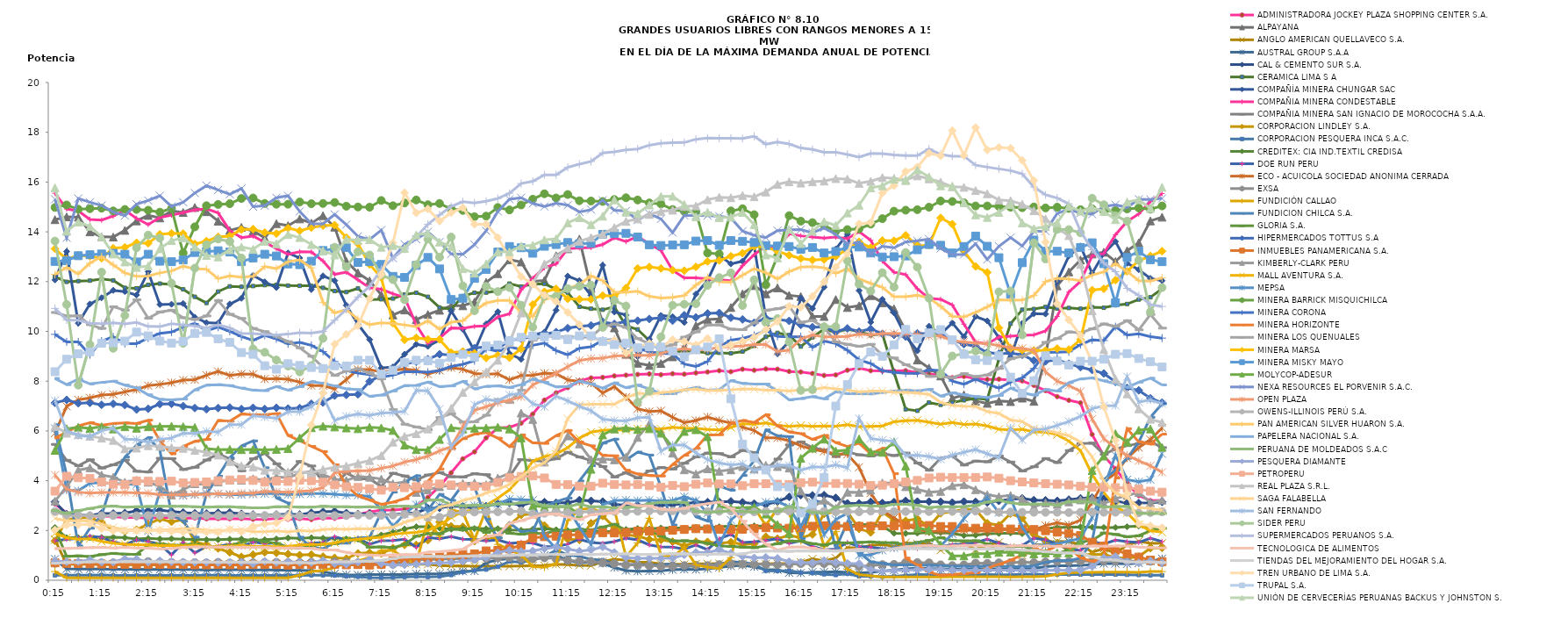
| Category | ADMINISTRADORA JOCKEY PLAZA SHOPPING CENTER S.A. | ALPAYANA | ANGLO AMERICAN QUELLAVECO S.A. | AUSTRAL GROUP S.A.A | CAL & CEMENTO SUR S.A. | CERAMICA LIMA S A | COMPAÑÍA MINERA CHUNGAR SAC | COMPAÑIA MINERA CONDESTABLE | COMPAÑIA MINERA SAN IGNACIO DE MOROCOCHA S.A.A. | CORPORACION LINDLEY S.A. | CORPORACION PESQUERA INCA S.A.C. | CREDITEX: CIA IND.TEXTIL CREDISA | DOE RUN PERU | ECO - ACUICOLA SOCIEDAD ANONIMA CERRADA | EXSA | FUNDICIÓN CALLAO | FUNDICION CHILCA S.A. | GLORIA S.A. | HIPERMERCADOS TOTTUS S.A | INMUEBLES PANAMERICANA S.A. | KIMBERLY-CLARK PERU | MALL AVENTURA S.A. | MEPSA | MINERA BARRICK MISQUICHILCA | MINERA CORONA | MINERA HORIZONTE | MINERA LOS QUENUALES | MINERA MARSA | MINERA MISKY MAYO | MOLYCOP-ADESUR | NEXA RESOURCES EL PORVENIR S.A.C. | OPEN PLAZA | OWENS-ILLINOIS PERÚ S.A. | PAN AMERICAN SILVER HUARON S.A. | PAPELERA NACIONAL S.A. | PERUANA DE MOLDEADOS S.A.C | PESQUERA DIAMANTE | PETROPERU | REAL PLAZA S.R.L. | SAGA FALABELLA | SAN FERNANDO | SIDER PERU | SUPERMERCADOS PERUANOS S.A. | TECNOLOGICA DE ALIMENTOS | TIENDAS DEL MEJORAMIENTO DEL HOGAR S.A. | TREN URBANO DE LIMA S.A. | TRUPAL S.A. | UNIÓN DE CERVECERÍAS PERUANAS BACKUS Y JOHNSTON S. |
|---|---|---|---|---|---|---|---|---|---|---|---|---|---|---|---|---|---|---|---|---|---|---|---|---|---|---|---|---|---|---|---|---|---|---|---|---|---|---|---|---|---|---|---|---|---|---|---|---|
| 2013-03-14 00:15:00 | 3.07 | 14.49 | 1.63 | 0.85 | 3.15 | 12.2 | 12.07 | 15.55 | 5.46 | 1.58 | 0.2 | 2.12 | 1.59 | 5.91 | 0.68 | 0.35 | 6.25 | 2.08 | 7.13 | 0.7 | 3.18 | 1.88 | 6.1 | 14.98 | 9.88 | 5.72 | 10.76 | 13.32 | 12.81 | 5.22 | 15.31 | 4.23 | 2.76 | 12.29 | 8.11 | 2.8 | 0.78 | 3.58 | 6.18 | 2.49 | 7.22 | 13.63 | 10.92 | 1.27 | 0.68 | 2.02 | 8.38 | 15.77 |
| 2013-03-14 00:30:00 | 2.7 | 14.6 | 0.64 | 0.46 | 2.65 | 11.99 | 13.21 | 14.92 | 4.82 | 2.43 | 0.2 | 1.71 | 1.64 | 6.99 | 0.7 | 0.1 | 4.24 | 0.96 | 7.25 | 0.68 | 3.76 | 1.71 | 3.62 | 15.08 | 9.58 | 5.95 | 10.62 | 12.9 | 12.84 | 6.09 | 13.76 | 3.66 | 2.6 | 12.57 | 7.86 | 2.69 | 0.74 | 4.18 | 5.91 | 2.39 | 6.01 | 11.08 | 10.46 | 1.28 | 0.71 | 2.22 | 8.88 | 14.02 |
| 2013-03-14 00:45:00 | 2.62 | 14.59 | 0.64 | 0.45 | 2.62 | 12.02 | 10.33 | 14.84 | 4.6 | 2.5 | 0.2 | 1.71 | 1.68 | 7.25 | 0.68 | 0.1 | 1.38 | 0.98 | 7.11 | 0.67 | 4.42 | 1.65 | 3.6 | 14.91 | 9.58 | 6.2 | 10.63 | 13.05 | 13.04 | 6.15 | 15.34 | 3.54 | 2.6 | 12.31 | 8.08 | 2.8 | 0.75 | 4.12 | 5.85 | 2.4 | 5.82 | 7.84 | 10.45 | 1.3 | 0.71 | 2.23 | 9.1 | 14.39 |
| 2013-03-14 01:00:00 | 2.57 | 14 | 0.64 | 0.45 | 2.6 | 12.04 | 11.1 | 14.5 | 4.84 | 2.52 | 0.2 | 1.71 | 1.77 | 7.33 | 0.71 | 0.1 | 2.09 | 0.95 | 7.13 | 0.66 | 4.52 | 1.67 | 3.9 | 14.93 | 9.06 | 6.33 | 10.27 | 13.02 | 13.08 | 6.1 | 15.19 | 3.5 | 2.59 | 12.74 | 7.89 | 2.88 | 0.82 | 4.09 | 5.79 | 2.37 | 5.77 | 9.47 | 10.33 | 1.31 | 0.74 | 2.25 | 9.18 | 14.22 |
| 2013-03-14 01:15:00 | 2.58 | 13.8 | 0.63 | 0.45 | 2.68 | 12.11 | 11.35 | 14.47 | 4.51 | 2.33 | 0.21 | 1.72 | 1.72 | 7.44 | 0.7 | 0.1 | 2.6 | 1.03 | 7.05 | 0.65 | 4.23 | 1.56 | 3.92 | 14.95 | 9.61 | 6.23 | 10.12 | 12.94 | 13.11 | 6.17 | 15.06 | 3.53 | 2.59 | 13.01 | 7.95 | 2.96 | 0.73 | 3.95 | 5.71 | 2.26 | 6.01 | 12.38 | 10.31 | 1.32 | 0.74 | 2.07 | 9.52 | 13.8 |
| 2013-03-14 01:30:00 | 2.56 | 13.79 | 0.63 | 0.44 | 2.68 | 12.05 | 11.65 | 14.63 | 4.64 | 2.02 | 0.19 | 1.73 | 1.55 | 7.47 | 0.7 | 0.1 | 4.1 | 1.08 | 7.09 | 0.64 | 4.14 | 1.49 | 3.88 | 14.84 | 9.78 | 6.3 | 10.99 | 13.34 | 13.14 | 6.08 | 14.8 | 3.53 | 2.6 | 12.67 | 8 | 2.98 | 0.73 | 3.86 | 5.62 | 2.12 | 6.11 | 9.32 | 10.34 | 1.3 | 0.72 | 1.99 | 9.54 | 13.11 |
| 2013-03-14 01:45:00 | 2.52 | 14.06 | 0.63 | 0.44 | 2.7 | 11.75 | 11.6 | 14.87 | 4.83 | 1.97 | 0.19 | 1.71 | 1.42 | 7.57 | 0.7 | 0.1 | 4.95 | 1.05 | 7.04 | 0.64 | 3.94 | 1.45 | 3.88 | 14.9 | 9.51 | 6.32 | 10.85 | 13.38 | 13.1 | 6.17 | 14.65 | 3.53 | 2.6 | 12.35 | 7.84 | 2.94 | 0.86 | 3.85 | 5.28 | 2.04 | 5.67 | 10.64 | 10.3 | 1.32 | 0.75 | 2 | 9.61 | 12.79 |
| 2013-03-14 02:00:00 | 2.52 | 14.44 | 0.63 | 0.43 | 2.79 | 11.73 | 11.46 | 14.54 | 4.38 | 2.03 | 0.19 | 1.66 | 1.62 | 7.66 | 0.74 | 0.1 | 5.43 | 1.04 | 6.86 | 0.64 | 4.02 | 1.43 | 3.84 | 14.9 | 9.51 | 6.3 | 11.27 | 13.56 | 12.79 | 6.11 | 15.11 | 3.51 | 2.59 | 12.21 | 7.73 | 2.95 | 0.85 | 3.99 | 5.31 | 2.02 | 5.65 | 13.36 | 10.36 | 1.3 | 0.74 | 1.99 | 9.97 | 12.57 |
| 2013-03-14 02:15:00 | 2.5 | 14.66 | 0.62 | 0.44 | 2.79 | 11.87 | 12.4 | 14.29 | 4.35 | 2.25 | 0.19 | 1.68 | 1.56 | 7.82 | 0.75 | 0.1 | 5.73 | 1.42 | 6.89 | 0.63 | 3.94 | 1.42 | 1.98 | 14.87 | 9.73 | 6.43 | 10.53 | 13.54 | 13.1 | 6.17 | 15.26 | 3.5 | 2.6 | 12.22 | 7.45 | 2.96 | 0.73 | 3.98 | 5.41 | 2.03 | 5.55 | 13.87 | 10.2 | 1.29 | 0.75 | 2 | 9.82 | 12.63 |
| 2013-03-14 02:30:00 | 2.52 | 14.56 | 0.62 | 0.43 | 2.81 | 11.92 | 11.08 | 14.58 | 4.9 | 2.47 | 0.19 | 1.66 | 1.45 | 7.87 | 0.73 | 0.1 | 5.23 | 1.47 | 7.08 | 0.64 | 3.77 | 1.39 | 3.56 | 14.79 | 9.92 | 5.6 | 10.78 | 13.9 | 12.82 | 6.18 | 15.45 | 3.44 | 2.6 | 12.35 | 7.27 | 2.97 | 0.78 | 3.97 | 5.38 | 2.02 | 5.66 | 13.75 | 10.19 | 1.26 | 0.74 | 2.01 | 9.61 | 13.32 |
| 2013-03-14 02:45:00 | 2.53 | 14.84 | 0.65 | 0.43 | 2.77 | 11.89 | 11.09 | 14.67 | 4.89 | 2.35 | 0.19 | 1.67 | 1.02 | 7.94 | 0.72 | 0.1 | 2.64 | 1.41 | 7.09 | 0.64 | 3.43 | 1.4 | 3.44 | 14.94 | 9.97 | 5.08 | 10.85 | 13.94 | 12.8 | 6.19 | 15.02 | 3.43 | 2.61 | 12.43 | 7.25 | 2.97 | 0.74 | 3.98 | 5.33 | 2.04 | 5.71 | 11.93 | 10.31 | 1.28 | 0.74 | 1.97 | 9.53 | 13.65 |
| 2013-03-14 03:00:00 | 2.49 | 14.78 | 0.65 | 0.43 | 2.72 | 11.69 | 11.12 | 14.77 | 4.45 | 2.43 | 0.19 | 1.65 | 1.52 | 8.04 | 0.7 | 0.1 | 2.37 | 1.41 | 7 | 0.63 | 3.64 | 1.38 | 3.4 | 13.15 | 10.17 | 5.38 | 10.55 | 13.93 | 12.87 | 6.17 | 15.19 | 3.44 | 2.6 | 12.62 | 7.28 | 2.97 | 0.73 | 3.91 | 5.3 | 2.07 | 5.91 | 9.52 | 10.26 | 1.32 | 0.74 | 1.94 | 9.6 | 13.76 |
| 2013-03-14 03:15:00 | 2.5 | 14.98 | 0.65 | 0.43 | 2.69 | 11.39 | 10.57 | 14.88 | 4.54 | 1.54 | 0.19 | 1.64 | 1.1 | 8.06 | 0.71 | 0.1 | 1.73 | 1.47 | 6.92 | 0.62 | 3.88 | 1.41 | 3.44 | 14.2 | 10.32 | 5.58 | 10.48 | 13.51 | 13.17 | 6.14 | 15.56 | 3.46 | 2.6 | 12.51 | 7.65 | 2.95 | 0.72 | 3.93 | 5.22 | 2.07 | 5.9 | 12.54 | 10.22 | 1.34 | 0.73 | 1.94 | 9.92 | 13.39 |
| 2013-03-14 03:30:00 | 2.47 | 14.81 | 0.64 | 0.41 | 2.68 | 11.14 | 10.35 | 14.93 | 4.83 | 1.43 | 0.2 | 1.63 | 1.36 | 8.24 | 0.7 | 0.1 | 3.46 | 1.36 | 6.87 | 0.62 | 3.85 | 1.36 | 3.5 | 15.05 | 10.02 | 5.66 | 10.62 | 13.63 | 13.21 | 5.29 | 15.86 | 3.45 | 2.6 | 12.5 | 7.84 | 2.94 | 0.72 | 3.95 | 5.14 | 2.01 | 5.99 | 13.48 | 10.13 | 1.34 | 0.73 | 1.94 | 9.96 | 13.05 |
| 2013-03-14 03:45:00 | 2.48 | 14.43 | 0.64 | 0.42 | 2.71 | 11.6 | 10.33 | 14.76 | 5.08 | 1.28 | 0.2 | 1.63 | 1.36 | 8.39 | 0.72 | 0.1 | 4.18 | 1.34 | 6.92 | 0.63 | 3.95 | 1.35 | 3.46 | 15.1 | 10.17 | 6.42 | 11.24 | 13.8 | 13.24 | 5.25 | 15.68 | 3.48 | 2.6 | 12.12 | 7.86 | 2.95 | 0.71 | 4 | 5.03 | 1.98 | 5.95 | 13.71 | 10.26 | 1.33 | 0.72 | 1.93 | 9.7 | 12.99 |
| 2013-03-14 04:00:00 | 2.47 | 14.06 | 0.64 | 0.42 | 2.72 | 11.81 | 11.1 | 14.05 | 4.88 | 1.12 | 0.19 | 1.65 | 1.45 | 8.23 | 0.69 | 0.1 | 4.92 | 1.4 | 6.94 | 0.62 | 4.03 | 1.37 | 3.44 | 15.13 | 10 | 6.39 | 10.69 | 13.83 | 13.19 | 5.26 | 15.51 | 3.46 | 2.59 | 12.23 | 7.82 | 2.95 | 0.72 | 4.03 | 4.77 | 2.04 | 6.25 | 13.61 | 10.14 | 1.33 | 0.73 | 2.04 | 9.56 | 13.28 |
| 2013-03-14 04:15:00 | 2.48 | 14.18 | 0.65 | 0.42 | 2.67 | 11.79 | 11.33 | 13.77 | 4.4 | 0.94 | 0.19 | 1.66 | 1.35 | 8.29 | 0.71 | 0.1 | 5.4 | 1.52 | 6.88 | 0.61 | 4.02 | 1.4 | 3.44 | 15.34 | 9.79 | 6.68 | 10.52 | 14.09 | 12.8 | 5.25 | 15.74 | 3.5 | 2.61 | 12.18 | 7.72 | 2.93 | 0.72 | 4.05 | 4.6 | 2.03 | 6.25 | 12.95 | 9.92 | 1.33 | 0.72 | 1.96 | 9.15 | 13.39 |
| 2013-03-14 04:30:00 | 2.45 | 14.03 | 0.66 | 0.41 | 2.64 | 11.82 | 12.25 | 13.83 | 4.88 | 1.03 | 0.19 | 1.59 | 1.53 | 8.28 | 0.7 | 0.1 | 5.6 | 1.65 | 6.93 | 0.63 | 4.08 | 1.36 | 3.46 | 15.36 | 9.64 | 6.65 | 10.12 | 14.11 | 12.95 | 5.26 | 15.01 | 3.5 | 2.6 | 12.21 | 7.64 | 2.91 | 0.66 | 4.01 | 4.55 | 1.95 | 6.61 | 9.3 | 9.91 | 1.32 | 0.73 | 2.16 | 9.08 | 13.3 |
| 2013-03-14 04:45:00 | 2.44 | 13.76 | 0.66 | 0.42 | 2.6 | 11.86 | 11.99 | 13.58 | 5.1 | 1.12 | 0.19 | 1.63 | 1.47 | 8.09 | 0.71 | 0.1 | 4.52 | 1.55 | 6.88 | 0.63 | 4.01 | 1.36 | 3.48 | 15.14 | 9.84 | 6.65 | 9.99 | 13.97 | 13.1 | 5.24 | 15.05 | 3.57 | 2.6 | 12.61 | 7.62 | 2.91 | 0.76 | 3.94 | 4.42 | 1.95 | 6.56 | 9.16 | 9.88 | 1.31 | 0.73 | 2.26 | 8.62 | 13.62 |
| 2013-03-14 05:00:00 | 2.49 | 14.33 | 0.66 | 0.41 | 2.64 | 11.87 | 11.76 | 13.33 | 4.68 | 1.1 | 0.19 | 1.66 | 1.5 | 8.1 | 0.72 | 0.1 | 3.31 | 1.48 | 6.93 | 0.63 | 4.15 | 1.35 | 3.48 | 15.11 | 9.7 | 6.7 | 9.8 | 13.93 | 13.03 | 5.26 | 15.37 | 3.55 | 2.61 | 12.52 | 7.78 | 2.95 | 0.71 | 3.98 | 4.42 | 1.98 | 6.51 | 8.85 | 9.85 | 1.3 | 0.71 | 2.3 | 8.48 | 13.52 |
| 2013-03-14 05:15:00 | 2.45 | 14.25 | 0.66 | 0.41 | 2.65 | 11.84 | 13.15 | 13.1 | 4.28 | 1.05 | 0.2 | 1.7 | 1.32 | 8.08 | 0.71 | 0.1 | 3.1 | 1.32 | 6.9 | 0.61 | 4.12 | 1.36 | 3.44 | 15.11 | 9.5 | 5.82 | 9.59 | 14.15 | 12.71 | 5.29 | 15.45 | 3.54 | 2.59 | 12.8 | 7.64 | 2.95 | 0.74 | 3.97 | 4.36 | 1.94 | 6.77 | 8.61 | 9.89 | 1.3 | 0.69 | 2.52 | 8.7 | 13.89 |
| 2013-03-14 05:30:00 | 2.48 | 14.52 | 0.65 | 0.4 | 2.64 | 11.83 | 12.95 | 13.2 | 4.77 | 1.01 | 0.19 | 1.68 | 1.41 | 7.96 | 0.71 | 0.2 | 1.73 | 1.29 | 6.92 | 0.63 | 4.3 | 1.42 | 3.46 | 15.2 | 9.56 | 5.61 | 9.34 | 14.04 | 12.68 | 5.72 | 14.82 | 3.57 | 2.59 | 12.87 | 7.78 | 2.94 | 0.72 | 4.02 | 4.35 | 2 | 6.77 | 8.37 | 9.95 | 1.3 | 0.71 | 4.19 | 8.63 | 13.77 |
| 2013-03-14 05:45:00 | 2.44 | 14.35 | 0.64 | 0.39 | 2.71 | 11.83 | 11.68 | 13.19 | 4.59 | 1.03 | 0.2 | 1.71 | 1.49 | 7.82 | 0.72 | 0.35 | 1.32 | 1.39 | 7.09 | 0.63 | 4.37 | 1.44 | 3.48 | 15.13 | 9.44 | 5.38 | 9 | 14.17 | 12.82 | 6.13 | 14.33 | 3.6 | 2.59 | 12.55 | 7.98 | 2.94 | 0.71 | 4 | 4.32 | 1.97 | 6.98 | 8.62 | 9.93 | 1.28 | 0.69 | 6.24 | 8.55 | 13.49 |
| 2013-03-14 06:00:00 | 2.5 | 14.65 | 0.64 | 0.34 | 2.75 | 11.75 | 12.23 | 12.83 | 3.95 | 0.95 | 0.2 | 1.69 | 1.52 | 7.82 | 0.71 | 0.39 | 1.27 | 1.45 | 7.14 | 0.64 | 4.24 | 1.45 | 3.48 | 15.14 | 9.19 | 5.17 | 8.56 | 14.25 | 13.25 | 6.19 | 14.32 | 3.73 | 2.6 | 11.17 | 7.91 | 2.97 | 0.8 | 3.94 | 4.45 | 2.04 | 7.38 | 9.72 | 10 | 1.22 | 0.72 | 7.52 | 8.51 | 13.24 |
| 2013-03-14 06:15:00 | 2.49 | 14.19 | 0.64 | 0.26 | 2.77 | 11.62 | 12.04 | 12.29 | 3.86 | 0.9 | 0.19 | 1.69 | 1.75 | 7.69 | 0.75 | 0.51 | 1.5 | 1.47 | 7.42 | 0.64 | 4.06 | 1.5 | 3.46 | 15.18 | 8.79 | 4.64 | 8.23 | 14.27 | 13.32 | 6.16 | 14.7 | 4.32 | 2.6 | 10.74 | 7.81 | 2.95 | 0.67 | 3.83 | 4.54 | 2.06 | 6.42 | 13.38 | 10.45 | 1.22 | 0.74 | 9.49 | 8.62 | 13.07 |
| 2013-03-14 06:30:00 | 2.54 | 12.82 | 0.63 | 0.22 | 2.7 | 11.58 | 11.05 | 12.38 | 4.31 | 0.87 | 0.16 | 1.66 | 1.62 | 8.06 | 0.73 | 0.7 | 1.49 | 1.69 | 7.45 | 0.62 | 4.01 | 1.6 | 3.42 | 15.03 | 8.43 | 3.8 | 8.41 | 13.77 | 13.37 | 6.12 | 14.29 | 4.38 | 2.6 | 10.88 | 7.69 | 2.95 | 0.64 | 3.76 | 4.59 | 2.05 | 6.59 | 12.59 | 10.88 | 1.12 | 0.74 | 9.88 | 8.61 | 13.7 |
| 2013-03-14 06:45:00 | 2.64 | 12.35 | 0.63 | 0.21 | 2.66 | 11.73 | 10.29 | 12.07 | 4.07 | 1.08 | 0.14 | 1.65 | 1.68 | 8.47 | 0.7 | 0.78 | 1.7 | 1.62 | 7.47 | 0.63 | 4.17 | 1.64 | 3.42 | 15 | 8.32 | 3.39 | 8.5 | 13.52 | 12.77 | 6.09 | 13.82 | 4.39 | 2.62 | 10.49 | 7.66 | 2.94 | 0.73 | 3.73 | 4.7 | 2.07 | 6.68 | 13.2 | 11.38 | 1.03 | 0.76 | 10.23 | 8.84 | 13.66 |
| 2013-03-14 07:00:00 | 2.75 | 12.03 | 0.64 | 0.23 | 2.67 | 11.28 | 9.67 | 11.75 | 4.07 | 1.11 | 0.11 | 1.69 | 1.45 | 8.47 | 0.68 | 0.91 | 1.72 | 1.33 | 7.99 | 0.61 | 4.14 | 1.69 | 3.36 | 14.99 | 8.26 | 3.22 | 8.32 | 12.69 | 12.8 | 6.15 | 13.69 | 4.41 | 2.61 | 10.27 | 7.39 | 2.95 | 0.85 | 3.68 | 4.81 | 2.06 | 6.62 | 13.07 | 11.81 | 1.01 | 0.76 | 11.32 | 8.84 | 13.69 |
| 2013-03-14 07:15:00 | 2.81 | 11.47 | 0.66 | 0.23 | 2.63 | 11.29 | 8.53 | 11.69 | 3.77 | 1.07 | 0.1 | 1.82 | 1.59 | 8.36 | 0.62 | 1.2 | 2.74 | 1.34 | 8.23 | 0.64 | 4.07 | 1.73 | 2.84 | 15.26 | 8.16 | 3.05 | 8.09 | 12.16 | 12.69 | 6.12 | 14.07 | 4.5 | 2.61 | 10.34 | 7.44 | 2.92 | 0.67 | 3.62 | 5.01 | 2.08 | 6.72 | 12.26 | 12.5 | 1 | 0.8 | 12.29 | 8.28 | 13.38 |
| 2013-03-14 07:30:00 | 2.82 | 10.66 | 0.73 | 0.23 | 2.64 | 11.32 | 8.57 | 11.51 | 4.3 | 1.29 | 0.11 | 1.93 | 1.6 | 8.43 | 0.64 | 1.2 | 3.54 | 1.31 | 8.46 | 0.78 | 3.88 | 1.84 | 2.16 | 15.05 | 8.24 | 3.14 | 6.86 | 10.33 | 12.21 | 6.02 | 12.94 | 4.59 | 2.62 | 10.32 | 7.61 | 2.97 | 0.61 | 3.74 | 5.55 | 2.13 | 6.74 | 12.08 | 12.94 | 1.02 | 0.87 | 13.55 | 8.44 | 13.45 |
| 2013-03-14 07:45:00 | 2.86 | 10.86 | 0.69 | 0.23 | 2.68 | 11.48 | 9.08 | 11.37 | 4.19 | 1.42 | 0.13 | 2.06 | 1.65 | 8.49 | 0.75 | 0.89 | 3.94 | 1.44 | 8.69 | 0.86 | 3.95 | 1.9 | 2.66 | 15.16 | 8.38 | 3.28 | 6.27 | 9.66 | 12.17 | 5.43 | 13.5 | 4.75 | 2.65 | 10.26 | 7.82 | 2.98 | 0.62 | 3.72 | 5.78 | 2.33 | 6.79 | 11.27 | 13.31 | 1.03 | 0.93 | 15.57 | 8.75 | 13.33 |
| 2013-03-14 08:00:00 | 2.96 | 10.47 | 0.64 | 0.26 | 2.71 | 11.55 | 9.48 | 10.26 | 4.03 | 1.42 | 0.15 | 2.15 | 1.32 | 8.43 | 0.81 | 0.67 | 4.2 | 1.77 | 8.78 | 0.88 | 3.53 | 1.92 | 3.04 | 15.28 | 8.38 | 3.59 | 6.16 | 9.74 | 12.65 | 5.25 | 13.7 | 4.85 | 2.66 | 10.19 | 7.83 | 2.95 | 0.64 | 3.76 | 5.89 | 2.47 | 7.63 | 12.68 | 13.8 | 1.04 | 0.94 | 14.76 | 8.84 | 13.88 |
| 2013-03-14 08:15:00 | 3.33 | 10.68 | 0.64 | 0.26 | 2.89 | 11.39 | 9.4 | 9.53 | 4.23 | 1.61 | 0.13 | 2.15 | 1.72 | 8.28 | 0.85 | 2.42 | 2.82 | 1.88 | 8.88 | 0.89 | 3.63 | 2 | 2.78 | 15.09 | 8.36 | 3.98 | 6.05 | 9.68 | 12.97 | 5.24 | 14 | 4.99 | 2.52 | 10.42 | 7.96 | 3.22 | 0.68 | 3.83 | 6.08 | 2.57 | 7.61 | 13.71 | 14.3 | 1.13 | 0.96 | 14.92 | 8.82 | 13.94 |
| 2013-03-14 08:30:00 | 3.77 | 10.85 | 0.59 | 0.26 | 2.91 | 10.96 | 9.65 | 9.73 | 4.33 | 2.34 | 0.15 | 2.1 | 1.67 | 8.43 | 0.84 | 1.76 | 3.45 | 1.87 | 9.08 | 0.95 | 3.76 | 2.21 | 3 | 15.14 | 8.43 | 4.47 | 6.54 | 9.68 | 12.51 | 5.66 | 13.59 | 5.2 | 2.53 | 10.09 | 7.78 | 3.23 | 0.69 | 3.87 | 6.4 | 2.94 | 6.88 | 12.98 | 14.68 | 1.15 | 0.95 | 14.43 | 8.72 | 13.59 |
| 2013-03-14 08:45:00 | 4.32 | 11.03 | 0.57 | 0.3 | 2.98 | 10.89 | 10.82 | 10.14 | 4.16 | 2.17 | 0.21 | 2.05 | 1.75 | 8.54 | 0.87 | 2.82 | 3.21 | 2.06 | 9.05 | 1.01 | 3.82 | 2.52 | 3.02 | 14.92 | 8.59 | 5.29 | 6.69 | 9.15 | 11.28 | 6.13 | 13.11 | 5.36 | 2.67 | 10.37 | 7.81 | 3.04 | 0.71 | 3.83 | 6.91 | 3.03 | 5.37 | 13.79 | 15.02 | 1.19 | 0.95 | 14.77 | 8.95 | 13.41 |
| 2013-03-14 09:00:00 | 4.88 | 11.03 | 0.58 | 0.36 | 2.96 | 11.42 | 10.08 | 10.12 | 4.15 | 2.15 | 0.33 | 2.07 | 1.65 | 8.48 | 0.86 | 2.73 | 3.85 | 2.02 | 9.18 | 1.03 | 3.89 | 2.77 | 3 | 14.86 | 8.68 | 5.69 | 6.35 | 9.19 | 11.33 | 6.08 | 13.1 | 6.18 | 2.73 | 10.42 | 7.99 | 2.99 | 0.76 | 3.78 | 7.55 | 3.2 | 5.9 | 11.83 | 15.21 | 1.25 | 0.97 | 14.97 | 9.08 | 12.52 |
| 2013-03-14 09:15:00 | 5.16 | 11.18 | 0.56 | 0.37 | 2.89 | 11.55 | 9.21 | 10.2 | 4.28 | 1.57 | 0.39 | 2.08 | 1.64 | 8.31 | 0.85 | 1.62 | 3.75 | 2.11 | 9.33 | 1.06 | 3.91 | 2.81 | 3 | 14.61 | 8.82 | 5.87 | 6.37 | 9.12 | 12.13 | 6.11 | 13.49 | 6.83 | 2.74 | 10.83 | 7.69 | 3.02 | 0.83 | 3.77 | 7.97 | 3.32 | 7.05 | 10.83 | 15.16 | 1.53 | 0.98 | 14.3 | 8.97 | 12.34 |
| 2013-03-14 09:30:00 | 5.72 | 11.97 | 0.56 | 0.7 | 2.98 | 11.56 | 10.3 | 10.22 | 4.24 | 1.71 | 0.43 | 2.07 | 1.58 | 8.28 | 0.88 | 2.86 | 2.46 | 1.92 | 9.38 | 1.18 | 3.84 | 3.01 | 2.98 | 14.63 | 9.3 | 5.93 | 6.63 | 8.93 | 12.49 | 6.12 | 14.04 | 6.97 | 2.74 | 11.14 | 7.79 | 3 | 0.91 | 3.77 | 8.37 | 3.51 | 7.27 | 11.81 | 15.23 | 1.76 | 1 | 14.31 | 9.41 | 12.71 |
| 2013-03-14 09:45:00 | 6.12 | 12.32 | 0.56 | 0.83 | 3.07 | 11.62 | 10.79 | 10.58 | 3.87 | 1.68 | 0.54 | 2.07 | 1.62 | 8.3 | 0.9 | 1.44 | 1.7 | 2.07 | 9.3 | 1.2 | 4.11 | 3.3 | 3.06 | 14.98 | 9.2 | 5.71 | 7.26 | 9.04 | 13.19 | 6.15 | 14.82 | 7.13 | 2.75 | 11.24 | 7.81 | 3.07 | 1.11 | 3.93 | 8.84 | 3.64 | 7.2 | 11.6 | 15.34 | 1.83 | 0.98 | 13.77 | 9.45 | 13.19 |
| 2013-03-14 10:00:00 | 6.15 | 12.88 | 0.56 | 0.86 | 3.11 | 11.92 | 9.11 | 10.71 | 4.17 | 2.21 | 0.76 | 2.02 | 1.48 | 8.05 | 0.91 | 1.23 | 2.31 | 1.89 | 9.64 | 1.26 | 4.3 | 3.63 | 3.26 | 14.88 | 9.38 | 5.37 | 7.14 | 8.94 | 13.41 | 6.08 | 15.31 | 7.24 | 2.76 | 11.24 | 7.74 | 3.06 | 1.21 | 4.12 | 9.55 | 3.86 | 7.45 | 11.76 | 15.55 | 2.29 | 1 | 12.97 | 9.62 | 13.2 |
| 2013-03-14 10:15:00 | 6.31 | 12.79 | 0.57 | 0.96 | 3.01 | 11.8 | 8.88 | 11.67 | 4.85 | 2.63 | 0.72 | 2.01 | 1.52 | 8.23 | 0.86 | 1.02 | 1.95 | 1.85 | 9.71 | 1.41 | 6.72 | 4.14 | 3.24 | 15.08 | 9.27 | 5.84 | 7.64 | 9.3 | 13.36 | 5.72 | 15.37 | 7.37 | 2.78 | 10.76 | 7.86 | 3.11 | 1.16 | 4.17 | 10.74 | 4.16 | 7.51 | 11.05 | 15.94 | 2.4 | 1.02 | 12.2 | 9.76 | 13.43 |
| 2013-03-14 10:30:00 | 6.68 | 12.01 | 0.58 | 1.03 | 3.14 | 11.9 | 9.85 | 12.13 | 4.81 | 2.66 | 0.81 | 2.05 | 1.5 | 8.24 | 0.86 | 0.55 | 1.99 | 1.89 | 9.79 | 1.7 | 6.46 | 4.78 | 3.22 | 15.31 | 9.44 | 5.52 | 9.65 | 11.08 | 13.14 | 2.99 | 15.14 | 7.85 | 2.67 | 10.6 | 8.08 | 3.14 | 1.18 | 4.19 | 11.94 | 4.51 | 7.09 | 10.17 | 16.03 | 2.53 | 1.01 | 11.9 | 9.81 | 13.46 |
| 2013-03-14 10:45:00 | 7.24 | 12.05 | 0.59 | 1 | 3.14 | 11.91 | 9.97 | 12.56 | 4.79 | 2.2 | 0.94 | 2.07 | 1.35 | 8.32 | 0.9 | 0.52 | 2.96 | 1.88 | 9.89 | 1.75 | 4.75 | 4.97 | 1.78 | 15.53 | 9.53 | 5.5 | 9.84 | 11.59 | 13.42 | 2.95 | 15.02 | 8.07 | 2.69 | 11.27 | 7.95 | 3 | 1.27 | 4.11 | 12.71 | 4.72 | 6.97 | 11.42 | 16.29 | 2.65 | 1.03 | 11.45 | 9.78 | 13.68 |
| 2013-03-14 11:00:00 | 7.53 | 13.04 | 0.64 | 1 | 3.11 | 11.7 | 10.85 | 12.71 | 4.88 | 1.95 | 1.21 | 2.03 | 1.36 | 8.3 | 0.88 | 0.66 | 3.16 | 1.98 | 9.97 | 1.77 | 5.12 | 5.07 | 1.26 | 15.36 | 9.23 | 5.81 | 9.77 | 11.71 | 13.49 | 2.95 | 15.15 | 8.32 | 2.73 | 11.47 | 7.77 | 2.96 | 1.33 | 3.85 | 12.99 | 5.2 | 7.4 | 11.41 | 16.29 | 2.66 | 1.04 | 11.2 | 9.84 | 13.72 |
| 2013-03-14 11:15:00 | 7.74 | 13.32 | 0.63 | 0.81 | 3.11 | 11.56 | 12.22 | 13.32 | 5.14 | 1.65 | 1.02 | 1.99 | 1.45 | 8.05 | 0.8 | 2.4 | 3.3 | 1.99 | 10.13 | 1.82 | 5.8 | 5.33 | 2.9 | 15.5 | 9.06 | 6.02 | 9.8 | 11.31 | 13.57 | 2.96 | 15.07 | 8.58 | 2.72 | 11.72 | 7.79 | 2.96 | 1.25 | 3.84 | 13.35 | 6.49 | 7.21 | 11.72 | 16.59 | 2.53 | 1.04 | 10.76 | 9.67 | 14.36 |
| 2013-03-14 11:30:00 | 8.01 | 13.71 | 0.6 | 0.7 | 3.22 | 10.99 | 12.04 | 13.35 | 4.95 | 1.62 | 0.96 | 1.99 | 1.65 | 7.99 | 0.76 | 2.85 | 3.99 | 2.05 | 10.2 | 1.83 | 5.48 | 5.71 | 2.14 | 15.25 | 9.32 | 5.55 | 9.75 | 11.29 | 13.52 | 2.65 | 14.8 | 8.83 | 2.73 | 11.88 | 8 | 3.06 | 1.17 | 3.78 | 13.62 | 7.05 | 6.99 | 11.81 | 16.72 | 2.44 | 1.04 | 10.28 | 9.82 | 14.57 |
| 2013-03-14 11:45:00 | 8.13 | 11.73 | 0.59 | 0.74 | 3.19 | 10.91 | 11.45 | 13.37 | 4.81 | 2.29 | 0.84 | 1.96 | 1.52 | 7.92 | 0.75 | 2.88 | 4.6 | 2.02 | 10.24 | 1.88 | 4.85 | 5.95 | 1.44 | 15.24 | 9.38 | 5.4 | 9.78 | 11.29 | 13.54 | 4.46 | 14.89 | 8.91 | 2.76 | 12.23 | 7.89 | 2.95 | 1.22 | 3.78 | 13.77 | 7.07 | 6.81 | 11.86 | 16.83 | 2.63 | 1.03 | 9.74 | 9.82 | 14.29 |
| 2013-03-14 12:00:00 | 8.15 | 10.38 | 0.75 | 0.68 | 3.16 | 10.87 | 12.66 | 13.49 | 4.57 | 2.58 | 0.81 | 1.96 | 1.48 | 7.52 | 0.7 | 2.72 | 5.51 | 2.14 | 10.38 | 1.91 | 4.87 | 6.02 | 3.04 | 15.22 | 9.64 | 5.02 | 10.18 | 11.44 | 13.9 | 5.84 | 15.27 | 8.92 | 2.77 | 12.04 | 7.72 | 2.95 | 1.34 | 3.9 | 13.91 | 7.07 | 6.47 | 10.16 | 17.17 | 2.67 | 1.05 | 9.6 | 9.59 | 14.63 |
| 2013-03-14 12:15:00 | 8.21 | 10.14 | 0.85 | 0.51 | 3.05 | 10.99 | 10.78 | 13.76 | 4.15 | 2.13 | 0.67 | 1.97 | 1.55 | 7.78 | 0.67 | 2.85 | 5.67 | 2.25 | 10.3 | 1.9 | 4.84 | 6.05 | 3.2 | 15.3 | 9.67 | 5 | 10.3 | 11.42 | 13.93 | 6.08 | 14.87 | 9.01 | 2.77 | 11.58 | 7.93 | 2.91 | 1.12 | 3.85 | 14.17 | 7.07 | 6.42 | 11.25 | 17.21 | 2.71 | 1.05 | 9.65 | 9.47 | 15.29 |
| 2013-03-14 12:30:00 | 8.24 | 9.08 | 0.8 | 0.39 | 3.02 | 10.22 | 10.66 | 13.61 | 4.32 | 1.83 | 0.63 | 2.04 | 1.69 | 7.36 | 0.62 | 0.94 | 4.83 | 2.02 | 10.4 | 1.92 | 4.95 | 6.03 | 3.22 | 15.37 | 9.2 | 4.42 | 10.16 | 11.74 | 13.94 | 6.12 | 14.84 | 9.03 | 2.76 | 11.57 | 7.74 | 2.93 | 0.91 | 3.83 | 14.42 | 7.32 | 6.4 | 11.02 | 17.29 | 3.1 | 1.07 | 9.14 | 9.53 | 14.79 |
| 2013-03-14 12:45:00 | 8.27 | 8.72 | 0.73 | 0.36 | 2.99 | 10.08 | 8.99 | 13.81 | 4.11 | 1.77 | 0.64 | 2.08 | 1.62 | 6.89 | 0.61 | 1.5 | 5.15 | 1.91 | 10.43 | 1.97 | 5.74 | 6.08 | 3.2 | 15.28 | 9.33 | 4.27 | 9.71 | 12.53 | 13.79 | 6.06 | 14.47 | 9.05 | 2.77 | 11.61 | 7.84 | 2.95 | 0.88 | 3.85 | 14.52 | 7.52 | 6.53 | 7.15 | 17.33 | 3 | 1.04 | 9.37 | 9.34 | 14.74 |
| 2013-03-14 13:00:00 | 8.29 | 8.63 | 0.72 | 0.37 | 3.04 | 9.63 | 9.69 | 13.52 | 4.39 | 1.64 | 0.61 | 2.06 | 1.42 | 6.78 | 0.6 | 2.49 | 5.03 | 2.02 | 10.5 | 1.97 | 6.29 | 6.08 | 3.22 | 15.16 | 9.18 | 4.21 | 9.5 | 12.59 | 13.48 | 6.09 | 14.73 | 9.03 | 2.79 | 11.41 | 7.69 | 3.07 | 0.88 | 3.8 | 14.7 | 7.47 | 6.55 | 7.6 | 17.48 | 2.98 | 1.04 | 9.52 | 9.38 | 15.08 |
| 2013-03-14 13:15:00 | 8.26 | 8.71 | 0.65 | 0.38 | 3.02 | 9.2 | 10.64 | 13.25 | 4.53 | 1.62 | 0.63 | 2.1 | 1.34 | 6.81 | 0.56 | 1.02 | 3.75 | 1.78 | 10.55 | 1.98 | 5.98 | 6.08 | 3.18 | 15.12 | 9.12 | 4.19 | 9.35 | 12.53 | 13.45 | 5.91 | 14.52 | 9.11 | 2.78 | 11.34 | 7.5 | 3.13 | 0.88 | 3.74 | 14.82 | 7.54 | 5.19 | 9.78 | 17.56 | 2.86 | 1.05 | 9.37 | 9.37 | 15.42 |
| 2013-03-14 13:30:00 | 8.3 | 8.98 | 0.64 | 0.42 | 3.03 | 9.2 | 10.59 | 12.45 | 4.47 | 1.55 | 0.66 | 2.11 | 1.33 | 6.55 | 0.56 | 0.94 | 2.22 | 1.58 | 10.43 | 2.01 | 5.11 | 6.15 | 3.2 | 14.9 | 9.1 | 4.65 | 9.46 | 12.46 | 13.47 | 5.36 | 13.97 | 9.24 | 2.79 | 11.37 | 7.5 | 3.14 | 0.89 | 3.81 | 14.87 | 7.58 | 5.44 | 11.05 | 17.58 | 2.83 | 1.07 | 9.67 | 9.2 | 15.43 |
| 2013-03-14 13:45:00 | 8.28 | 9.38 | 0.64 | 0.44 | 3.08 | 9.2 | 10.36 | 12.15 | 4.7 | 1.38 | 0.53 | 2.09 | 1.25 | 6.33 | 0.59 | 1.32 | 3.32 | 1.59 | 10.65 | 2.04 | 4.44 | 6.11 | 3.36 | 14.82 | 8.69 | 5.02 | 9.77 | 12.44 | 13.48 | 5.98 | 14.66 | 9.3 | 2.8 | 11.44 | 7.65 | 3.13 | 1.02 | 3.76 | 15.02 | 7.65 | 5.43 | 11.09 | 17.59 | 2.89 | 1.06 | 9.59 | 8.98 | 15.1 |
| 2013-03-14 14:00:00 | 8.33 | 10.23 | 0.66 | 0.43 | 3.13 | 9.2 | 11.5 | 12.15 | 4.96 | 1.55 | 0.6 | 2.12 | 1.42 | 6.42 | 0.6 | 0.62 | 2.55 | 1.56 | 10.56 | 2.07 | 4.27 | 6.1 | 3.2 | 14.8 | 8.59 | 5.3 | 9.98 | 12.59 | 13.63 | 6.05 | 14.66 | 9.24 | 2.77 | 11.86 | 7.75 | 2.77 | 1.12 | 3.86 | 15.04 | 7.68 | 5.12 | 11.11 | 17.72 | 3.01 | 1.04 | 9.45 | 9.26 | 14.6 |
| 2013-03-14 14:15:00 | 8.37 | 10.48 | 0.66 | 0.46 | 3.14 | 9.13 | 12.05 | 12.11 | 5.11 | 1.54 | 0.61 | 2.11 | 1.23 | 6.56 | 0.59 | 0.53 | 2.38 | 1.48 | 10.72 | 2.06 | 4.48 | 6.06 | 2.7 | 13.15 | 8.79 | 5.84 | 10.26 | 12.81 | 13.65 | 5.77 | 14.65 | 9.28 | 2.76 | 12.18 | 7.64 | 2.73 | 1.11 | 3.91 | 15.29 | 7.62 | 4.85 | 11.85 | 17.77 | 3.08 | 1.04 | 9.72 | 9.37 | 14.79 |
| 2013-03-14 14:30:00 | 8.42 | 10.5 | 0.67 | 0.51 | 3.15 | 9.14 | 13.06 | 12.07 | 5.09 | 1.48 | 0.65 | 2.15 | 1.66 | 6.42 | 0.63 | 0.47 | 3.79 | 1.38 | 10.74 | 2.05 | 4.38 | 6.04 | 1.4 | 13.11 | 9.39 | 5.85 | 10.26 | 12.85 | 13.46 | 2.95 | 14.63 | 9.36 | 2.77 | 11.99 | 7.66 | 2.75 | 1.22 | 3.87 | 15.39 | 7.63 | 4.72 | 12.16 | 17.76 | 3.14 | 1.06 | 9.33 | 9.7 | 14.57 |
| 2013-03-14 14:45:00 | 8.38 | 10.96 | 0.66 | 0.57 | 3.17 | 9.12 | 12.71 | 12.04 | 4.96 | 1.53 | 0.74 | 2.18 | 1.85 | 6.32 | 0.65 | 0.91 | 3.62 | 1.36 | 10.55 | 2.04 | 4.44 | 6.14 | 2.42 | 14.84 | 9.65 | 6.3 | 10.09 | 13.02 | 13.65 | 2.91 | 14.56 | 9.39 | 2.78 | 11.98 | 8.02 | 2.8 | 1.09 | 3.87 | 15.37 | 7.65 | 4.63 | 12.35 | 17.76 | 2.88 | 1.05 | 9.46 | 7.29 | 14.59 |
| 2013-03-14 15:00:00 | 8.48 | 11.51 | 0.66 | 0.6 | 3.13 | 9.19 | 12.82 | 12.64 | 5.22 | 1.44 | 0.72 | 2.18 | 1.52 | 6.15 | 0.65 | 2.79 | 4.21 | 1.33 | 10.48 | 2.05 | 4.57 | 6.29 | 2.82 | 14.93 | 9.72 | 6.42 | 10.07 | 13.14 | 13.62 | 2.91 | 14.03 | 9.42 | 2.75 | 12.26 | 7.91 | 2.76 | 0.96 | 3.8 | 15.46 | 7.69 | 4.68 | 11.04 | 17.75 | 2.37 | 1.06 | 9.6 | 5.47 | 14.78 |
| 2013-03-14 15:15:00 | 8.44 | 11.84 | 0.65 | 0.54 | 3.08 | 9.42 | 13.42 | 13.08 | 5.13 | 1.46 | 0.65 | 2.19 | 1.54 | 6.02 | 0.64 | 2.92 | 4.81 | 1.31 | 10.35 | 2.08 | 4.47 | 6.27 | 2.96 | 14.69 | 9.84 | 6.34 | 10.34 | 13.42 | 13.57 | 2.94 | 13.86 | 9.47 | 2.75 | 12.52 | 7.88 | 2.74 | 0.9 | 3.88 | 15.41 | 7.68 | 4.41 | 12.07 | 17.84 | 1.85 | 1.15 | 9.76 | 4.92 | 14.29 |
| 2013-03-14 15:30:00 | 8.49 | 11.51 | 0.66 | 0.43 | 3.04 | 9.78 | 10.55 | 13.44 | 4.42 | 1.75 | 0.38 | 2.16 | 1.6 | 5.72 | 0.64 | 2.2 | 6.04 | 1.38 | 10.52 | 2.11 | 4.62 | 6.32 | 3.14 | 11.87 | 10.04 | 6.65 | 10.85 | 13.39 | 13.45 | 2.66 | 13.77 | 9.47 | 2.77 | 12.36 | 7.88 | 2.75 | 0.92 | 3.88 | 15.6 | 7.64 | 4.51 | 10.36 | 17.52 | 1.45 | 1.17 | 10.07 | 4.43 | 13.07 |
| 2013-03-14 15:45:00 | 8.48 | 11.75 | 0.67 | 0.42 | 3.16 | 9.94 | 9.1 | 13.34 | 4.87 | 1.67 | 0.37 | 2.14 | 1.67 | 5.72 | 0.63 | 2.89 | 5.8 | 1.47 | 10.48 | 2.1 | 4.57 | 6.23 | 3.18 | 13.02 | 9.8 | 6.2 | 10.91 | 13.22 | 13.43 | 2.24 | 14.05 | 9.19 | 2.78 | 12.11 | 7.61 | 2.77 | 0.88 | 3.86 | 15.91 | 7.64 | 4.63 | 10.51 | 17.61 | 1.21 | 1.17 | 10.4 | 3.76 | 12.95 |
| 2013-03-14 16:00:00 | 8.39 | 11.45 | 0.67 | 0.3 | 3.35 | 9.85 | 9.59 | 13.92 | 5.43 | 1.81 | 0.39 | 2.14 | 1.48 | 5.6 | 0.64 | 2.7 | 5.77 | 1.58 | 10.42 | 2.09 | 4.51 | 6.18 | 2.94 | 14.65 | 9.78 | 5.96 | 11.02 | 13.06 | 13.41 | 1.88 | 14.08 | 9.25 | 2.78 | 12.4 | 7.25 | 2.96 | 0.75 | 3.85 | 16.01 | 7.6 | 4.62 | 9.57 | 17.53 | 1.33 | 1.16 | 11.01 | 3.75 | 14.1 |
| 2013-03-14 16:15:00 | 8.37 | 11.4 | 0.72 | 0.29 | 3.42 | 9.39 | 11.34 | 13.84 | 5.56 | 1.7 | 0.31 | 2.16 | 1.59 | 5.4 | 0.67 | 1.59 | 1.68 | 1.57 | 10.26 | 2.11 | 3.59 | 6.22 | 2.14 | 14.43 | 9.79 | 5.89 | 10.36 | 12.93 | 13.3 | 4.9 | 14.09 | 9.69 | 2.79 | 12.58 | 7.3 | 2.87 | 0.72 | 3.92 | 15.96 | 7.65 | 4.42 | 7.63 | 17.37 | 1.34 | 1.18 | 10.97 | 2.7 | 13.53 |
| 2013-03-14 16:30:00 | 8.31 | 10.6 | 0.86 | 0.33 | 3.41 | 9.76 | 10.92 | 13.79 | 5.33 | 1.84 | 0.29 | 2.17 | 1.36 | 5.26 | 0.67 | 2.98 | 3.21 | 1.47 | 10.17 | 2.17 | 2.94 | 6.18 | 3.14 | 14.37 | 9.36 | 5.66 | 10.44 | 12.87 | 13.37 | 5.31 | 13.96 | 9.86 | 2.78 | 12.6 | 7.38 | 2.73 | 0.7 | 3.94 | 16.01 | 7.66 | 4.56 | 7.66 | 17.31 | 1.29 | 1.17 | 11.41 | 3.06 | 14.03 |
| 2013-03-14 16:45:00 | 8.23 | 10.6 | 0.78 | 0.33 | 3.42 | 10.09 | 11.78 | 13.75 | 5.23 | 2.67 | 0.24 | 2.21 | 1.23 | 5.18 | 0.67 | 1.35 | 3.12 | 1.41 | 10.18 | 2.19 | 3.22 | 6.2 | 1.84 | 14.26 | 9.61 | 5.82 | 10.16 | 12.89 | 13.15 | 5.67 | 14.16 | 9.78 | 2.77 | 12.56 | 7.29 | 2.69 | 0.79 | 3.9 | 16.04 | 7.74 | 4.54 | 10.19 | 17.2 | 1.22 | 1.18 | 11.99 | 4.13 | 14.41 |
| 2013-03-14 17:00:00 | 8.25 | 11.28 | 0.89 | 0.34 | 3.31 | 9.97 | 13.31 | 13.79 | 4.97 | 2.76 | 0.21 | 2.19 | 1.25 | 5.08 | 0.65 | 1.95 | 1.28 | 1.52 | 9.99 | 2.2 | 2.89 | 6.19 | 2.44 | 14.02 | 9.51 | 5.53 | 9.58 | 13.01 | 13.21 | 5.19 | 13.9 | 9.78 | 2.75 | 12.33 | 7.57 | 2.93 | 0.72 | 3.89 | 16.14 | 7.69 | 4.64 | 10.19 | 17.2 | 1.18 | 1.17 | 12.58 | 7 | 14.26 |
| 2013-03-14 17:15:00 | 8.44 | 10.96 | 1.31 | 0.32 | 3.09 | 10.09 | 13.91 | 13.72 | 5.16 | 2.75 | 0.26 | 2.19 | 1.52 | 5.06 | 0.62 | 0.44 | 2.33 | 1.5 | 10.12 | 2.16 | 3.54 | 6.25 | 2.7 | 14.09 | 9.24 | 5.37 | 9.48 | 13.32 | 13.39 | 5.23 | 13.52 | 9.8 | 2.76 | 12.52 | 7.5 | 2.99 | 0.68 | 3.89 | 16.12 | 7.65 | 4.52 | 12.84 | 17.11 | 1.22 | 1.18 | 13.13 | 7.86 | 14.76 |
| 2013-03-14 17:30:00 | 8.53 | 11.03 | 1.3 | 0.29 | 3.09 | 9.99 | 11.64 | 14.01 | 5.04 | 2.07 | 0.16 | 2.24 | 1.36 | 4.54 | 0.56 | 0.23 | 1.12 | 1.52 | 9.99 | 2.17 | 3.53 | 6.17 | 1 | 14.12 | 8.86 | 5.51 | 9.4 | 13.6 | 13.39 | 5.68 | 13.59 | 9.89 | 2.75 | 12.1 | 7.5 | 3.02 | 0.67 | 3.86 | 15.95 | 7.57 | 6.5 | 11.9 | 17 | 1.25 | 1.19 | 14.32 | 8.7 | 15.07 |
| 2013-03-14 17:45:00 | 8.42 | 11.44 | 1.4 | 0.32 | 3.15 | 9.84 | 10.37 | 13.66 | 4.99 | 1.92 | 0.16 | 2.23 | 1.33 | 3.5 | 0.59 | 0.18 | 0.74 | 1.54 | 10.1 | 2.17 | 3.62 | 6.18 | 1.02 | 14.31 | 8.71 | 5.08 | 9.48 | 13.36 | 13.15 | 5.16 | 13.12 | 9.86 | 2.78 | 11.93 | 7.49 | 2.99 | 0.42 | 3.81 | 16.03 | 7.6 | 5.7 | 11.62 | 17.15 | 1.16 | 1.19 | 14.37 | 9.17 | 15.77 |
| 2013-03-14 18:00:00 | 8.41 | 11.15 | 1.44 | 0.37 | 3.1 | 9.9 | 11.29 | 12.83 | 5.09 | 2.74 | 0.14 | 2.17 | 1.26 | 2.82 | 0.63 | 0.13 | 0.68 | 1.51 | 9.9 | 2.19 | 3.91 | 6.2 | 1.2 | 14.53 | 8.42 | 5.3 | 9.05 | 13.65 | 12.99 | 5.14 | 13.42 | 9.91 | 2.77 | 11.77 | 7.55 | 2.98 | 0.36 | 3.82 | 16.18 | 7.6 | 5.63 | 12.36 | 17.14 | 1.21 | 1.21 | 15.56 | 9 | 15.85 |
| 2013-03-14 18:15:00 | 8.41 | 10.91 | 1.36 | 0.41 | 3.14 | 8.35 | 10.74 | 12.38 | 5.01 | 2.41 | 0.16 | 1.89 | 1.26 | 2.5 | 0.64 | 0.13 | 0.62 | 1.51 | 9.86 | 2.18 | 3.91 | 6.37 | 1.3 | 14.83 | 8.35 | 4.28 | 8.93 | 13.64 | 13 | 5.56 | 13.36 | 9.92 | 2.76 | 11.39 | 7.6 | 3.05 | 0.39 | 3.88 | 16.15 | 7.55 | 5.58 | 11.78 | 17.09 | 1.27 | 1.25 | 15.86 | 9.46 | 16.11 |
| 2013-03-14 18:30:00 | 8.42 | 10.04 | 1.51 | 0.46 | 3.19 | 6.87 | 9.81 | 12.28 | 5.11 | 2.39 | 0.19 | 1.88 | 1.3 | 2.2 | 0.72 | 0.13 | 0.62 | 1.42 | 9.79 | 2.21 | 3.76 | 6.41 | 1.36 | 14.87 | 8.32 | 0.89 | 8.66 | 13.86 | 13.03 | 4.59 | 13.59 | 9.91 | 2.76 | 11.39 | 7.64 | 3.05 | 0.41 | 3.95 | 16.09 | 7.55 | 5.02 | 13.17 | 17.06 | 1.35 | 1.27 | 16.42 | 10.08 | 16.06 |
| 2013-03-14 18:45:00 | 8.35 | 8.85 | 1.46 | 0.49 | 3.16 | 6.81 | 9.22 | 11.71 | 4.71 | 2.47 | 0.23 | 1.89 | 1.28 | 2.05 | 0.71 | 0.13 | 0.62 | 1.52 | 9.92 | 2.22 | 3.65 | 6.43 | 1.38 | 14.89 | 8.31 | 0.61 | 8.46 | 13.45 | 13.28 | 2.09 | 13.64 | 9.87 | 2.76 | 11.45 | 7.61 | 3.01 | 0.43 | 4.01 | 16.25 | 7.52 | 5.03 | 12.58 | 17.06 | 1.38 | 1.28 | 16.6 | 9.7 | 16.49 |
| 2013-03-14 19:00:00 | 8.29 | 8.53 | 1.5 | 0.47 | 3.16 | 7.14 | 10.21 | 11.33 | 4.42 | 2.15 | 0.22 | 1.92 | 1.38 | 1.95 | 0.7 | 0.13 | 0.6 | 1.6 | 9.9 | 2.2 | 3.54 | 6.35 | 1.38 | 14.99 | 8.46 | 0.32 | 8.19 | 13.46 | 13.49 | 2.02 | 13.71 | 9.81 | 2.76 | 11.34 | 7.67 | 2.92 | 0.43 | 4.11 | 16.13 | 7.47 | 4.97 | 11.33 | 17.33 | 1.39 | 1.27 | 17.16 | 9.94 | 16.21 |
| 2013-03-14 19:15:00 | 8.24 | 8.21 | 1.21 | 0.46 | 3.15 | 7.05 | 9.89 | 11.29 | 4.9 | 2.69 | 0.22 | 1.91 | 1.35 | 1.98 | 0.62 | 0.13 | 0.59 | 1.71 | 9.88 | 2.16 | 3.57 | 6.27 | 1.38 | 15.24 | 8.42 | 0.2 | 8.19 | 14.56 | 13.46 | 1.42 | 13.33 | 9.82 | 2.77 | 11.01 | 7.4 | 2.95 | 0.43 | 4.14 | 16 | 7.15 | 4.86 | 8.29 | 17.11 | 1.36 | 1.27 | 17.05 | 10.07 | 15.85 |
| 2013-03-14 19:30:00 | 8.14 | 7.31 | 1.36 | 0.45 | 3.12 | 7.14 | 10.34 | 11.06 | 5 | 2.76 | 0.22 | 1.89 | 1.43 | 1.94 | 0.59 | 0.14 | 0.56 | 1.6 | 9.66 | 2.16 | 3.8 | 6.34 | 1.86 | 15.22 | 8 | 0.23 | 8.14 | 14.31 | 13.15 | 0.98 | 13.09 | 9.62 | 2.77 | 10.6 | 7.53 | 2.95 | 0.41 | 4.13 | 15.81 | 7.03 | 5.03 | 9.01 | 17.04 | 1.38 | 1.27 | 18.07 | 9.66 | 15.84 |
| 2013-03-14 19:45:00 | 8.19 | 7.45 | 1.48 | 0.43 | 3.16 | 7.23 | 9.78 | 10.29 | 4.63 | 2.84 | 0.22 | 1.8 | 1.45 | 2.02 | 0.62 | 0.14 | 0.56 | 1.58 | 9.49 | 2.1 | 3.84 | 6.26 | 2.48 | 15.17 | 7.88 | 0.27 | 8.3 | 13.22 | 13.41 | 0.98 | 13.09 | 9.58 | 2.76 | 10.58 | 7.45 | 2.96 | 0.4 | 4.13 | 15.79 | 6.99 | 5.14 | 9.11 | 17.04 | 1.4 | 1.27 | 17.07 | 9.08 | 15.17 |
| 2013-03-14 20:00:00 | 8.1 | 7.2 | 1.24 | 0.45 | 3.15 | 7.31 | 10.6 | 9.57 | 4.79 | 2.85 | 0.22 | 1.81 | 1.52 | 2 | 0.69 | 0.14 | 0.55 | 1.59 | 9.4 | 2.09 | 3.64 | 6.28 | 2.98 | 15.04 | 8.08 | 0.3 | 8.18 | 12.61 | 13.83 | 1.07 | 13.52 | 9.53 | 2.78 | 10.76 | 7.38 | 3.01 | 0.41 | 4.13 | 15.66 | 6.98 | 5.25 | 9.21 | 16.68 | 1.4 | 1.26 | 18.19 | 8.86 | 14.68 |
| 2013-03-14 20:15:00 | 8.07 | 7.11 | 1.42 | 0.47 | 3.13 | 7.27 | 10.42 | 9.5 | 4.76 | 2.29 | 0.23 | 1.87 | 1.65 | 1.97 | 0.68 | 0.14 | 0.57 | 1.46 | 9.15 | 2.11 | 3.44 | 6.2 | 3.32 | 15.04 | 7.89 | 0.5 | 8.25 | 12.37 | 13.42 | 1.07 | 12.89 | 9.51 | 2.77 | 10.98 | 7.35 | 3.14 | 0.41 | 4.15 | 15.53 | 6.78 | 5.08 | 9.06 | 16.6 | 1.38 | 1.26 | 17.29 | 8.83 | 14.58 |
| 2013-03-14 20:30:00 | 8.08 | 7.2 | 1.52 | 0.44 | 3.19 | 8.89 | 9.75 | 9.77 | 4.99 | 2.21 | 0.22 | 1.88 | 1.49 | 2.02 | 0.7 | 0.14 | 0.56 | 1.16 | 9.1 | 2.08 | 3.36 | 6.07 | 2.72 | 15.02 | 7.72 | 0.64 | 8.51 | 10.14 | 12.96 | 1.12 | 13.42 | 9.43 | 2.73 | 11.27 | 7.43 | 3.22 | 0.41 | 4.1 | 15.28 | 6.7 | 4.93 | 11.59 | 16.53 | 1.37 | 1.27 | 17.39 | 9.02 | 14.78 |
| 2013-03-14 20:45:00 | 8.04 | 7.18 | 1.32 | 0.47 | 3.25 | 10.31 | 8.96 | 9.81 | 4.75 | 2.68 | 0.22 | 1.9 | 1.36 | 2.05 | 0.71 | 0.13 | 0.55 | 1.35 | 9.13 | 2.06 | 3.41 | 6.04 | 3.3 | 14.99 | 7.96 | 0.81 | 8.9 | 9.32 | 11.49 | 1.13 | 13.77 | 9.35 | 2.74 | 11.25 | 7.72 | 3.11 | 0.41 | 4 | 15.25 | 6.44 | 6.12 | 11.62 | 16.46 | 1.38 | 1.24 | 17.36 | 8.16 | 15.1 |
| 2013-03-14 21:00:00 | 8.01 | 7.32 | 1 | 0.46 | 3.29 | 10.87 | 10.32 | 9.84 | 4.39 | 2.5 | 0.24 | 1.87 | 1.39 | 1.99 | 0.72 | 0.14 | 0.55 | 1.37 | 9.06 | 2.06 | 3.27 | 6.07 | 2.14 | 14.97 | 8.13 | 1.02 | 9 | 9.25 | 12.76 | 1.12 | 13.43 | 9.32 | 2.73 | 11.26 | 7.53 | 3.05 | 0.4 | 3.95 | 15.11 | 6.38 | 5.64 | 9.86 | 16.33 | 1.39 | 1.21 | 16.87 | 7.51 | 14.36 |
| 2013-03-14 21:15:00 | 7.83 | 7.19 | 1.43 | 0.48 | 3.22 | 10.9 | 10.71 | 9.86 | 4.56 | 1.84 | 0.25 | 2 | 1.69 | 2.02 | 0.71 | 0.14 | 0.58 | 1.24 | 8.83 | 2.04 | 2.95 | 5.96 | 1.42 | 15 | 8.51 | 1.26 | 9.2 | 9.23 | 13.67 | 1.06 | 14.02 | 9.24 | 2.73 | 11.44 | 7.44 | 3.06 | 0.4 | 3.91 | 14.85 | 6.1 | 6.04 | 13.56 | 15.8 | 1.38 | 1.2 | 16.06 | 8.02 | 14.13 |
| 2013-03-14 21:30:00 | 7.62 | 8.97 | 1.42 | 0.55 | 3.21 | 10.98 | 10.7 | 10.02 | 4.89 | 1.61 | 0.23 | 2.08 | 1.62 | 2.2 | 0.74 | 0.16 | 0.72 | 1.08 | 8.8 | 1.99 | 3.11 | 5.95 | 1.4 | 14.96 | 9.15 | 1.16 | 9.56 | 9.23 | 13.22 | 1.1 | 14.03 | 8.37 | 2.73 | 12 | 7.66 | 3.06 | 0.4 | 3.88 | 14.52 | 6.02 | 6.08 | 12.91 | 15.49 | 1.38 | 1.15 | 13.59 | 9.02 | 14.21 |
| 2013-03-14 21:45:00 | 7.38 | 11.83 | 1.56 | 0.58 | 3.19 | 10.92 | 12.01 | 10.6 | 4.73 | 1.5 | 0.23 | 2.12 | 1.45 | 2.31 | 0.76 | 0.24 | 0.79 | 1.06 | 8.85 | 1.93 | 3.05 | 5.85 | 1.46 | 14.99 | 9.16 | 1.39 | 9.71 | 9.31 | 13.22 | 1.1 | 14.74 | 8 | 2.73 | 12.13 | 7.6 | 3.02 | 0.41 | 3.86 | 14.14 | 5.92 | 6.22 | 14.1 | 15.36 | 1.36 | 1.11 | 11.11 | 8.81 | 14.37 |
| 2013-03-14 22:00:00 | 7.23 | 12.39 | 1.55 | 0.58 | 3.24 | 10.94 | 13.03 | 11.58 | 5.21 | 1.18 | 0.24 | 2.13 | 1.25 | 2.22 | 0.76 | 0.3 | 0.79 | 1.23 | 8.7 | 1.88 | 3.15 | 5.59 | 1.58 | 14.94 | 9.18 | 1.32 | 9.98 | 9.27 | 13.15 | 1.1 | 14.91 | 7.83 | 2.72 | 12.11 | 7.94 | 3.15 | 0.4 | 3.83 | 13.85 | 5.81 | 6.38 | 14.09 | 15.13 | 1.38 | 1.09 | 10.46 | 8.65 | 15.03 |
| 2013-03-14 22:15:00 | 7.13 | 12.87 | 1.43 | 0.6 | 3.29 | 10.91 | 13.43 | 12.01 | 5.49 | 1.02 | 0.23 | 2.14 | 1.2 | 2.42 | 0.77 | 0.32 | 0.89 | 1.54 | 8.56 | 1.8 | 3.23 | 5.21 | 1.68 | 14.89 | 9.47 | 0.9 | 9.94 | 9.67 | 13.37 | 1.52 | 14.75 | 7.59 | 2.73 | 12.04 | 8.09 | 3.16 | 0.4 | 3.78 | 12.69 | 5.55 | 6.59 | 13.96 | 14.03 | 1.37 | 1.09 | 9.83 | 8.8 | 14.83 |
| 2013-03-14 22:30:00 | 5.86 | 13.11 | 1.13 | 0.63 | 3.32 | 10.97 | 12.33 | 13.03 | 5.51 | 1.03 | 0.23 | 2.13 | 1.55 | 3.14 | 0.77 | 0.32 | 1.56 | 1.6 | 8.45 | 1.53 | 3.29 | 4.25 | 2.52 | 14.93 | 9.66 | 0.76 | 10.1 | 11.66 | 13.56 | 4.41 | 14.71 | 6.48 | 2.74 | 12.26 | 8.13 | 3.13 | 0.55 | 3.74 | 10.83 | 4.96 | 6.89 | 15.35 | 13.28 | 1.38 | 0.94 | 8.75 | 8.8 | 14.97 |
| 2013-03-14 22:45:00 | 5 | 13.18 | 1.27 | 0.67 | 3.28 | 10.95 | 13.13 | 13.13 | 5.06 | 1.04 | 0.23 | 2.12 | 1.46 | 3.97 | 0.78 | 0.33 | 4.04 | 1.9 | 8.31 | 1.37 | 3.08 | 3.53 | 3.72 | 14.83 | 9.63 | 0.93 | 10.3 | 11.71 | 12.72 | 4.99 | 15.02 | 5.69 | 2.73 | 12.39 | 8.01 | 2.94 | 0.9 | 3.73 | 9.27 | 3.98 | 7.01 | 15.09 | 12.75 | 1.37 | 0.82 | 6.97 | 8.88 | 14.82 |
| 2013-03-14 23:00:00 | 4.48 | 12.81 | 1.09 | 0.67 | 3.18 | 11.05 | 13.61 | 13.88 | 5.27 | 0.91 | 0.23 | 2.12 | 1.61 | 4.29 | 0.78 | 0.33 | 4.43 | 1.84 | 7.97 | 1.21 | 3.28 | 2.96 | 5.02 | 14.85 | 10.19 | 4.11 | 10.2 | 12.06 | 11.15 | 5.89 | 15.09 | 5.32 | 2.73 | 12.72 | 7.9 | 2.96 | 0.95 | 3.72 | 8.09 | 3.51 | 7.02 | 14.65 | 12.4 | 1.38 | 0.81 | 5.63 | 9.08 | 14.49 |
| 2013-03-14 23:15:00 | 3.89 | 13.24 | 1.41 | 0.66 | 3.1 | 11.1 | 12.74 | 14.42 | 5.41 | 0.88 | 0.22 | 2.15 | 1.55 | 4.91 | 0.77 | 0.33 | 4.9 | 1.75 | 7.73 | 1.06 | 3.41 | 2.71 | 4.04 | 14.92 | 9.85 | 6.09 | 10.43 | 12.41 | 12.97 | 5.55 | 14.98 | 5.02 | 2.73 | 12.41 | 7.75 | 2.97 | 0.74 | 3.71 | 7.49 | 3.31 | 8.18 | 14.43 | 11.73 | 1.38 | 0.74 | 3.47 | 9.11 | 15.2 |
| 2013-03-14 23:30:00 | 3.4 | 13.56 | 1.57 | 0.69 | 3.1 | 11.28 | 12.48 | 14.72 | 5.49 | 0.95 | 0.21 | 2.18 | 1.52 | 5.33 | 0.76 | 0.32 | 5.55 | 1.79 | 7.63 | 0.93 | 3.53 | 2.23 | 3.96 | 14.96 | 9.9 | 5.56 | 10.06 | 12.84 | 13.22 | 6.03 | 15.31 | 4.8 | 2.71 | 12.04 | 7.96 | 2.69 | 0.7 | 3.66 | 6.89 | 2.93 | 7.16 | 12.86 | 11.45 | 1.33 | 0.73 | 2.26 | 8.91 | 15.29 |
| 2013-03-14 23:45:00 | 3.2 | 14.44 | 1.48 | 0.76 | 3.11 | 11.37 | 12.13 | 15.22 | 5.58 | 1.29 | 0.2 | 2.14 | 1.69 | 5.65 | 0.76 | 0.35 | 6.55 | 1.99 | 7.31 | 0.81 | 3.12 | 1.99 | 4.04 | 14.91 | 9.79 | 5.47 | 10.68 | 13.03 | 12.88 | 6.08 | 15.3 | 4.6 | 2.72 | 12.02 | 8.12 | 2.68 | 0.78 | 3.58 | 6.47 | 2.88 | 7.25 | 10.78 | 11.08 | 1.31 | 0.73 | 2.19 | 8.78 | 14.94 |
| 2013-03-15 | 3.21 | 14.59 | 1.49 | 0.87 | 3.15 | 11.71 | 12.04 | 15.54 | 5.33 | 1.3 | 0.2 | 2.12 | 1.55 | 6.12 | 0.71 | 0.35 | 7.09 | 2.09 | 7.14 | 0.75 | 3.22 | 1.93 | 5.08 | 15.04 | 9.73 | 5.87 | 10.13 | 13.22 | 12.8 | 5.34 | 15.34 | 4.34 | 2.75 | 12.15 | 7.85 | 2.68 | 0.71 | 3.54 | 6.34 | 2.81 | 7.09 | 11.76 | 11 | 1.3 | 0.71 | 2.11 | 8.57 | 15.79 |